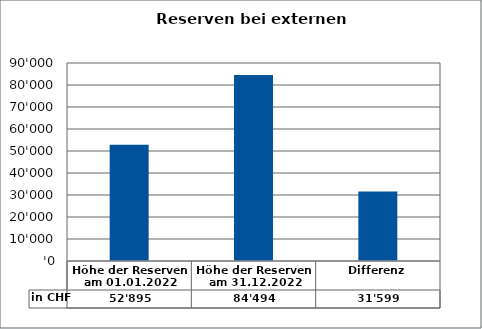
| Category | in CHF |
|---|---|
| Höhe der Reserven am 01.01.2022 | 52894.56 |
| Höhe der Reserven am 31.12.2022 | 84493.57 |
| Differenz | 31599.01 |